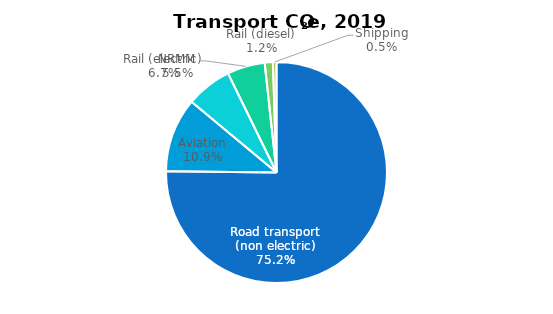
| Category | Series 0 |
|---|---|
| Road transport (non electric) | 6.512 |
| Aviation | 0.94 |
| Rail (electric) | 0.582 |
| NRMM | 0.478 |
| Rail (diesel) | 0.103 |
| Shipping | 0.045 |